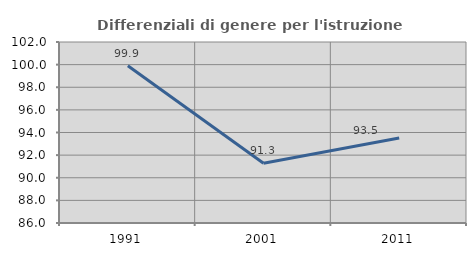
| Category | Differenziali di genere per l'istruzione superiore |
|---|---|
| 1991.0 | 99.899 |
| 2001.0 | 91.276 |
| 2011.0 | 93.515 |